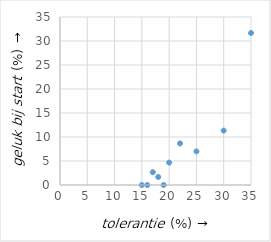
| Category | Series 0 |
|---|---|
| 35.0 | 31.667 |
| 30.0 | 11.333 |
| 25.0 | 7 |
| 22.0 | 8.667 |
| 20.0 | 4.667 |
| 19.0 | 0 |
| 18.0 | 1.667 |
| 17.0 | 2.667 |
| 16.0 | 0 |
| 15.0 | 0 |